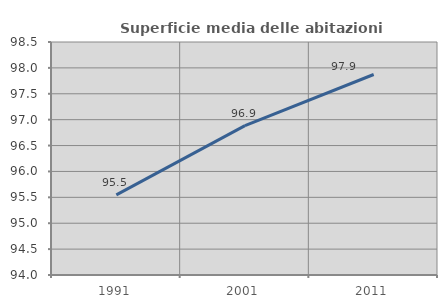
| Category | Superficie media delle abitazioni occupate |
|---|---|
| 1991.0 | 95.547 |
| 2001.0 | 96.885 |
| 2011.0 | 97.872 |